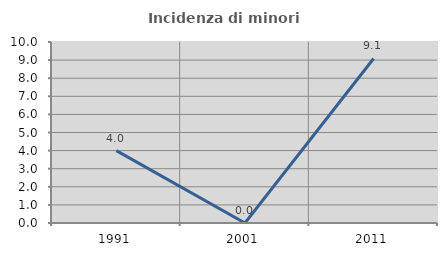
| Category | Incidenza di minori stranieri |
|---|---|
| 1991.0 | 4 |
| 2001.0 | 0 |
| 2011.0 | 9.091 |